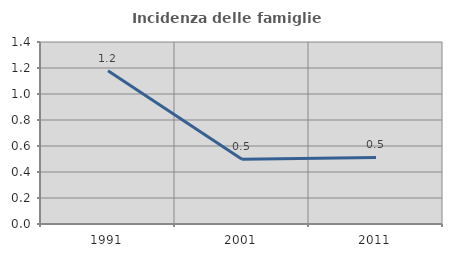
| Category | Incidenza delle famiglie numerose |
|---|---|
| 1991.0 | 1.179 |
| 2001.0 | 0.498 |
| 2011.0 | 0.512 |